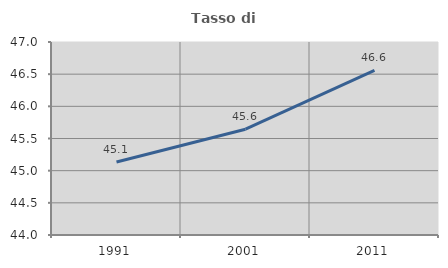
| Category | Tasso di occupazione   |
|---|---|
| 1991.0 | 45.135 |
| 2001.0 | 45.645 |
| 2011.0 | 46.558 |